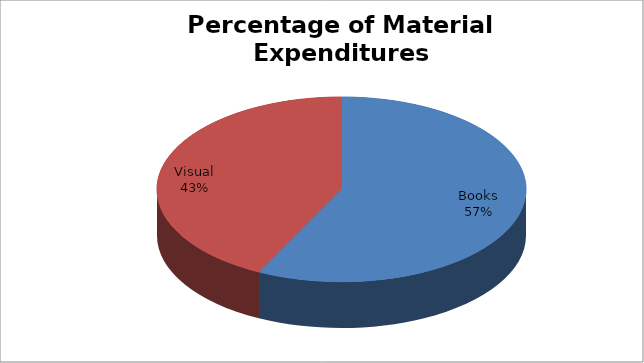
| Category | Series 0 |
|---|---|
| Books | 3700.57 |
| Visual | 2749.28 |